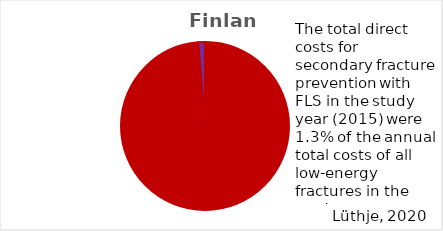
| Category | Finland |
|---|---|
| 0 | 6520000 |
| 1 | 85726 |
| 2 | 0 |